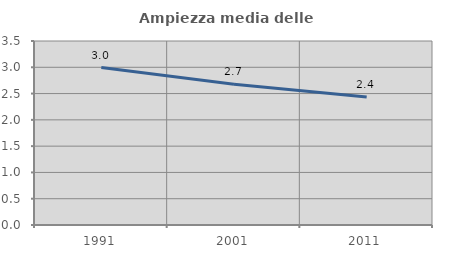
| Category | Ampiezza media delle famiglie |
|---|---|
| 1991.0 | 2.995 |
| 2001.0 | 2.679 |
| 2011.0 | 2.435 |